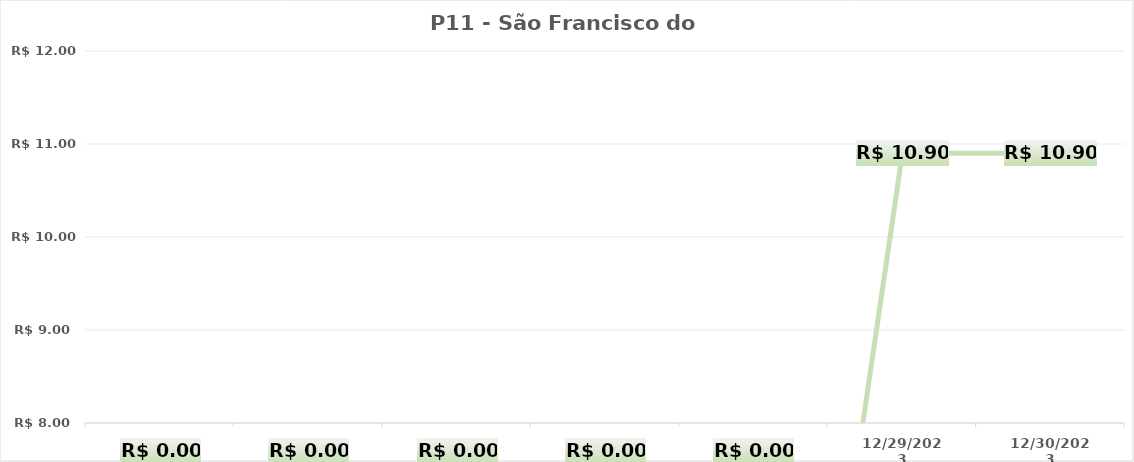
| Category | P11 - São Francisco do Glória |
|---|---|
|  | 0 |
|  | 0 |
|  | 0 |
|  | 0 |
|  | 0 |
| 29/12/2023 | 10.9 |
| 30/12/2023 | 10.9 |